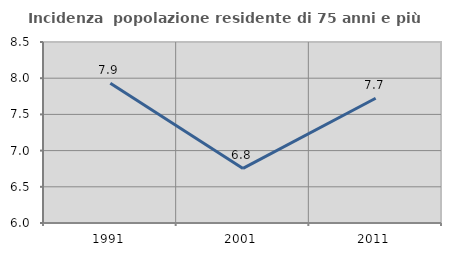
| Category | Incidenza  popolazione residente di 75 anni e più |
|---|---|
| 1991.0 | 7.931 |
| 2001.0 | 6.754 |
| 2011.0 | 7.724 |